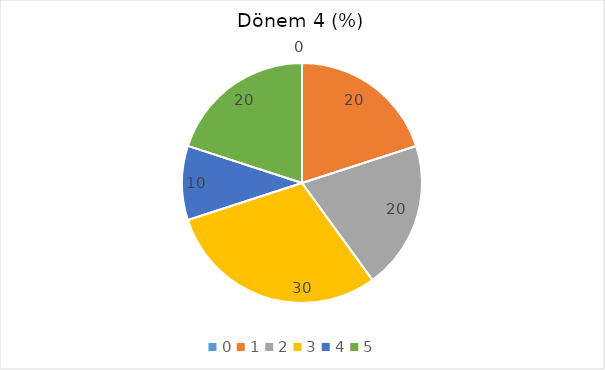
| Category | Dönem 4  (%) |
|---|---|
| 0.0 | 0 |
| 1.0 | 20 |
| 2.0 | 20 |
| 3.0 | 30 |
| 4.0 | 10 |
| 5.0 | 20 |